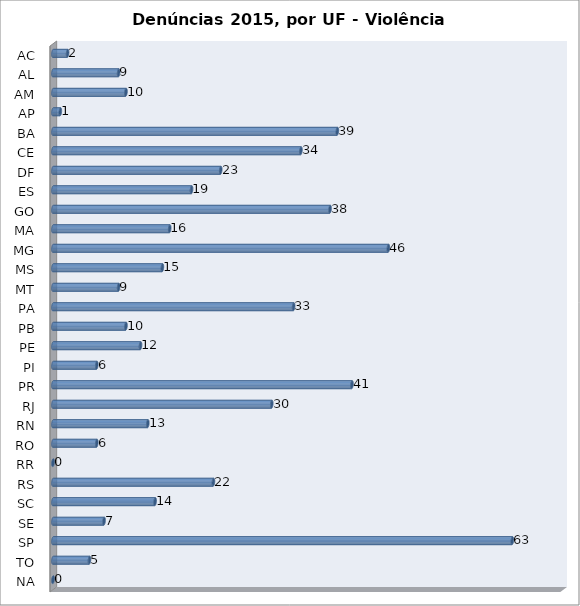
| Category | Series 0 |
|---|---|
| AC | 2 |
| AL | 9 |
| AM | 10 |
| AP | 1 |
| BA | 39 |
| CE | 34 |
| DF | 23 |
| ES | 19 |
| GO | 38 |
| MA | 16 |
| MG | 46 |
| MS | 15 |
| MT | 9 |
| PA | 33 |
| PB | 10 |
| PE | 12 |
| PI | 6 |
| PR | 41 |
| RJ | 30 |
| RN | 13 |
| RO | 6 |
| RR | 0 |
| RS | 22 |
| SC | 14 |
| SE | 7 |
| SP | 63 |
| TO | 5 |
| NA | 0 |